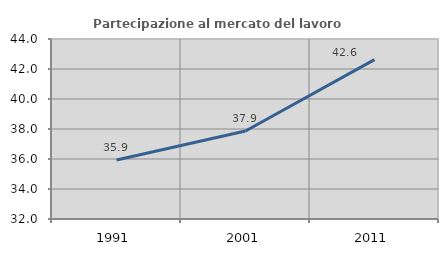
| Category | Partecipazione al mercato del lavoro  femminile |
|---|---|
| 1991.0 | 35.934 |
| 2001.0 | 37.87 |
| 2011.0 | 42.625 |